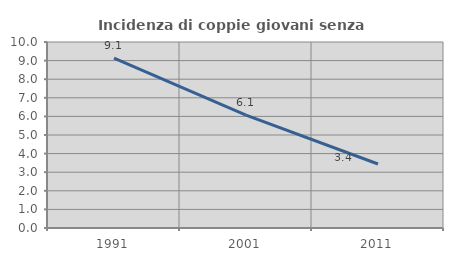
| Category | Incidenza di coppie giovani senza figli |
|---|---|
| 1991.0 | 9.133 |
| 2001.0 | 6.065 |
| 2011.0 | 3.441 |